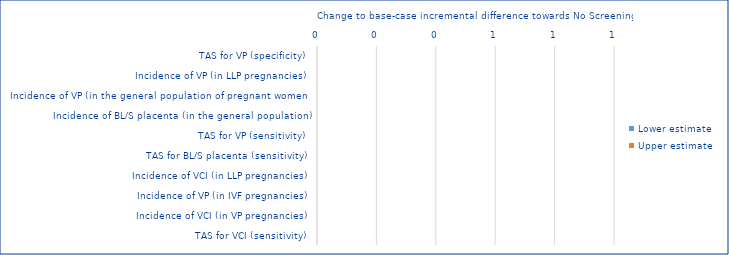
| Category | Lower estimate | Upper estimate |
|---|---|---|
| TAS for VP (specificity) | 0 | 0 |
| Incidence of VP (in LLP pregnancies) | 0 | 0 |
| Incidence of VP (in the general population of pregnant women) | 0 | 0 |
| Incidence of BL/S placenta (in the general population) | 0 | 0 |
| TAS for VP (sensitivity) | 0 | 0 |
| TAS for BL/S placenta (sensitivity) | 0 | 0 |
| Incidence of VCI (in LLP pregnancies) | 0 | 0 |
| Incidence of VP (in IVF pregnancies) | 0 | 0 |
| Incidence of VCI (in VP pregnancies) | 0 | 0 |
| TAS for VCI (sensitivity) | 0 | 0 |